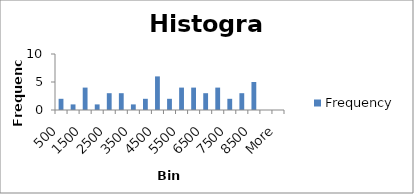
| Category | Frequency |
|---|---|
| 500 | 2 |
| 1000 | 1 |
| 1500 | 4 |
| 2000 | 1 |
| 2500 | 3 |
| 3000 | 3 |
| 3500 | 1 |
| 4000 | 2 |
| 4500 | 6 |
| 5000 | 2 |
| 5500 | 4 |
| 6000 | 4 |
| 6500 | 3 |
| 7000 | 4 |
| 7500 | 2 |
| 8000 | 3 |
| 8500 | 5 |
| 9000 | 0 |
| More | 0 |